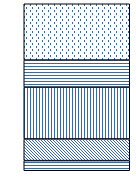
| Category | 18-25 | 25-30 | 30-40 | 40-50 | 50-65 |
|---|---|---|---|---|---|
| 0 | 6.068 | 12.986 | 31.043 | 16.191 | 33.712 |